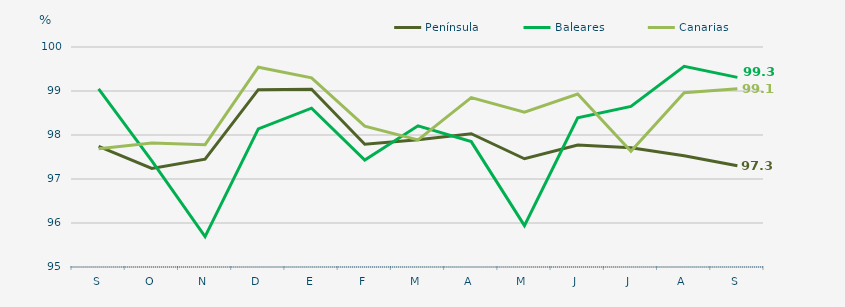
| Category | Península | Baleares | Canarias |
|---|---|---|---|
| S | 97.74 | 99.05 | 97.69 |
| O | 97.24 | 97.41 | 97.82 |
| N | 97.45 | 95.69 | 97.78 |
| D | 99.03 | 98.14 | 99.54 |
| E | 99.04 | 98.61 | 99.3 |
| F | 97.79 | 97.43 | 98.2 |
| M | 97.89 | 98.21 | 97.89 |
| A | 98.03 | 97.85 | 98.85 |
| M | 97.46 | 95.94 | 98.52 |
| J | 97.77 | 98.39 | 98.93 |
| J | 97.71 | 98.65 | 97.63 |
| A | 97.53 | 99.56 | 98.96 |
| S | 97.3 | 99.31 | 99.05 |